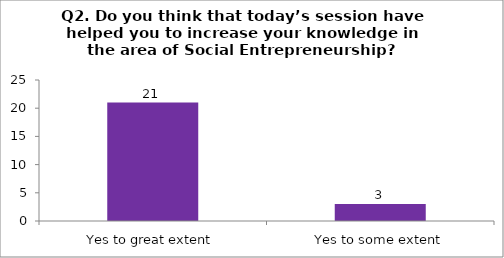
| Category | Q2. Do you think that today’s session have helped you to increase your knowledge in the area of Social Entrepreneurship? |
|---|---|
| Yes to great extent | 21 |
| Yes to some extent | 3 |